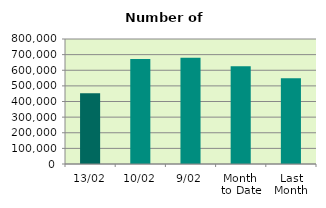
| Category | Series 0 |
|---|---|
| 13/02 | 453312 |
| 10/02 | 671556 |
| 9/02 | 679550 |
| Month 
to Date | 625353.111 |
| Last
Month | 549126.273 |